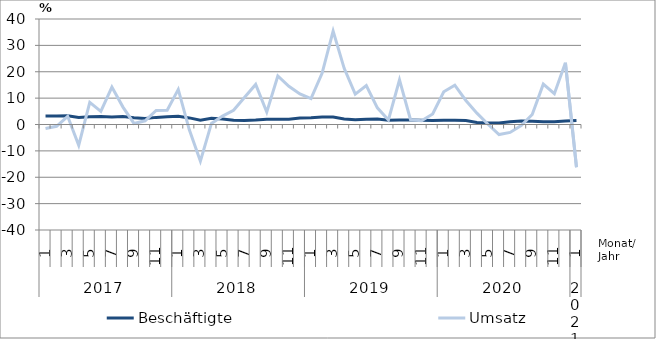
| Category | Beschäftigte | Umsatz |
|---|---|---|
| 0 | 3.2 | -1.5 |
| 1 | 3.2 | -0.7 |
| 2 | 3.3 | 3.1 |
| 3 | 2.7 | -7.9 |
| 4 | 2.9 | 8.4 |
| 5 | 3 | 5 |
| 6 | 2.8 | 14.2 |
| 7 | 3 | 6.6 |
| 8 | 2.6 | 0.4 |
| 9 | 2.3 | 1.4 |
| 10 | 2.7 | 5.3 |
| 11 | 2.9 | 5.4 |
| 12 | 3.1 | 13.3 |
| 13 | 2.5 | -2 |
| 14 | 1.6 | -13.9 |
| 15 | 2.4 | 0.4 |
| 16 | 2.1 | 3.2 |
| 17 | 1.6 | 5.4 |
| 18 | 1.5 | 10.3 |
| 19 | 1.7 | 15.2 |
| 20 | 2 | 4.7 |
| 21 | 2 | 18.4 |
| 22 | 2 | 14.5 |
| 23 | 2.5 | 11.6 |
| 24 | 2.6 | 9.8 |
| 25 | 2.8 | 19.4 |
| 26 | 2.8 | 35.4 |
| 27 | 2.1 | 21.3 |
| 28 | 1.8 | 11.5 |
| 29 | 2 | 14.8 |
| 30 | 2.1 | 6.3 |
| 31 | 1.6 | 1.7 |
| 32 | 1.7 | 16.9 |
| 33 | 1.7 | 1.8 |
| 34 | 1.6 | 1.4 |
| 35 | 1.5 | 4 |
| 36 | 1.6 | 12.4 |
| 37 | 1.6 | 14.9 |
| 38 | 1.5 | 9.1 |
| 39 | 0.8 | 4.3 |
| 40 | 0.6 | 0.1 |
| 41 | 0.6 | -3.8 |
| 42 | 1 | -3 |
| 43 | 1.3 | -0.4 |
| 44 | 1.2 | 3.8 |
| 45 | 1 | 15.3 |
| 46 | 1 | 11.7 |
| 47 | 1.3 | 23.4 |
| 48 | 1.5 | -16.2 |